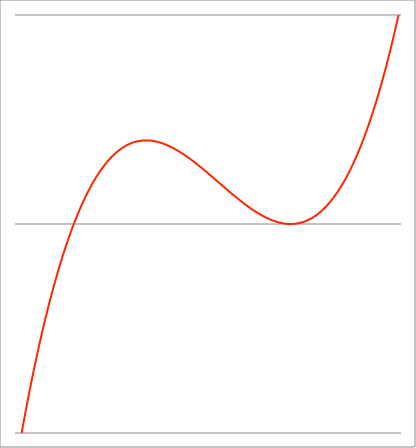
| Category | Series 1 |
|---|---|
| -3.8 | -1.155 |
| -3.79733 | -1.15 |
| -3.794659999999999 | -1.144 |
| -3.791989999999999 | -1.139 |
| -3.78932 | -1.133 |
| -3.786649999999999 | -1.128 |
| -3.783979999999999 | -1.123 |
| -3.781309999999999 | -1.117 |
| -3.778639999999998 | -1.112 |
| -3.775969999999998 | -1.106 |
| -3.773299999999998 | -1.101 |
| -3.770629999999998 | -1.096 |
| -3.767959999999998 | -1.09 |
| -3.765289999999998 | -1.085 |
| -3.762619999999997 | -1.08 |
| -3.759949999999997 | -1.074 |
| -3.757279999999997 | -1.069 |
| -3.754609999999997 | -1.064 |
| -3.751939999999997 | -1.059 |
| -3.749269999999996 | -1.053 |
| -3.746599999999996 | -1.048 |
| -3.743929999999996 | -1.043 |
| -3.741259999999996 | -1.038 |
| -3.738589999999996 | -1.032 |
| -3.735919999999996 | -1.027 |
| -3.733249999999995 | -1.022 |
| -3.730579999999995 | -1.017 |
| -3.727909999999995 | -1.012 |
| -3.725239999999995 | -1.006 |
| -3.722569999999995 | -1.001 |
| -3.719899999999995 | -0.996 |
| -3.717229999999994 | -0.991 |
| -3.714559999999994 | -0.986 |
| -3.711889999999994 | -0.981 |
| -3.709219999999994 | -0.976 |
| -3.706549999999994 | -0.971 |
| -3.703879999999994 | -0.966 |
| -3.701209999999993 | -0.961 |
| -3.698539999999993 | -0.956 |
| -3.695869999999993 | -0.951 |
| -3.693199999999993 | -0.946 |
| -3.690529999999993 | -0.941 |
| -3.687859999999992 | -0.936 |
| -3.685189999999992 | -0.931 |
| -3.682519999999992 | -0.926 |
| -3.679849999999992 | -0.921 |
| -3.677179999999992 | -0.916 |
| -3.674509999999992 | -0.911 |
| -3.671839999999991 | -0.906 |
| -3.669169999999991 | -0.901 |
| -3.666499999999991 | -0.896 |
| -3.663829999999991 | -0.891 |
| -3.661159999999991 | -0.886 |
| -3.658489999999991 | -0.881 |
| -3.65581999999999 | -0.877 |
| -3.65314999999999 | -0.872 |
| -3.65047999999999 | -0.867 |
| -3.64780999999999 | -0.862 |
| -3.64513999999999 | -0.857 |
| -3.64246999999999 | -0.852 |
| -3.639799999999989 | -0.848 |
| -3.637129999999989 | -0.843 |
| -3.634459999999989 | -0.838 |
| -3.631789999999989 | -0.833 |
| -3.629119999999989 | -0.829 |
| -3.626449999999989 | -0.824 |
| -3.623779999999988 | -0.819 |
| -3.621109999999988 | -0.814 |
| -3.618439999999988 | -0.81 |
| -3.615769999999988 | -0.805 |
| -3.613099999999988 | -0.8 |
| -3.610429999999988 | -0.796 |
| -3.607759999999987 | -0.791 |
| -3.605089999999987 | -0.786 |
| -3.602419999999987 | -0.782 |
| -3.599749999999987 | -0.777 |
| -3.597079999999987 | -0.773 |
| -3.594409999999987 | -0.768 |
| -3.591739999999986 | -0.763 |
| -3.589069999999986 | -0.759 |
| -3.586399999999986 | -0.754 |
| -3.583729999999986 | -0.75 |
| -3.581059999999986 | -0.745 |
| -3.578389999999986 | -0.741 |
| -3.575719999999985 | -0.736 |
| -3.573049999999985 | -0.732 |
| -3.570379999999985 | -0.727 |
| -3.567709999999985 | -0.723 |
| -3.565039999999985 | -0.718 |
| -3.562369999999984 | -0.714 |
| -3.559699999999984 | -0.709 |
| -3.557029999999984 | -0.705 |
| -3.554359999999984 | -0.7 |
| -3.551689999999984 | -0.696 |
| -3.549019999999984 | -0.692 |
| -3.546349999999983 | -0.687 |
| -3.543679999999983 | -0.683 |
| -3.541009999999983 | -0.678 |
| -3.538339999999983 | -0.674 |
| -3.535669999999983 | -0.67 |
| -3.532999999999983 | -0.665 |
| -3.530329999999982 | -0.661 |
| -3.527659999999982 | -0.657 |
| -3.524989999999982 | -0.652 |
| -3.522319999999982 | -0.648 |
| -3.519649999999982 | -0.644 |
| -3.516979999999982 | -0.639 |
| -3.514309999999981 | -0.635 |
| -3.511639999999981 | -0.631 |
| -3.508969999999981 | -0.627 |
| -3.506299999999981 | -0.622 |
| -3.503629999999981 | -0.618 |
| -3.500959999999981 | -0.614 |
| -3.49828999999998 | -0.61 |
| -3.49561999999998 | -0.606 |
| -3.49294999999998 | -0.601 |
| -3.49027999999998 | -0.597 |
| -3.48760999999998 | -0.593 |
| -3.484939999999979 | -0.589 |
| -3.482269999999979 | -0.585 |
| -3.479599999999979 | -0.581 |
| -3.476929999999979 | -0.577 |
| -3.474259999999979 | -0.572 |
| -3.471589999999979 | -0.568 |
| -3.468919999999978 | -0.564 |
| -3.466249999999978 | -0.56 |
| -3.463579999999978 | -0.556 |
| -3.460909999999978 | -0.552 |
| -3.458239999999978 | -0.548 |
| -3.455569999999978 | -0.544 |
| -3.452899999999977 | -0.54 |
| -3.450229999999977 | -0.536 |
| -3.447559999999977 | -0.532 |
| -3.444889999999977 | -0.528 |
| -3.442219999999977 | -0.524 |
| -3.439549999999977 | -0.52 |
| -3.436879999999976 | -0.516 |
| -3.434209999999976 | -0.512 |
| -3.431539999999976 | -0.508 |
| -3.428869999999976 | -0.504 |
| -3.426199999999976 | -0.5 |
| -3.423529999999976 | -0.496 |
| -3.420859999999975 | -0.493 |
| -3.418189999999975 | -0.489 |
| -3.415519999999975 | -0.485 |
| -3.412849999999975 | -0.481 |
| -3.410179999999975 | -0.477 |
| -3.407509999999974 | -0.473 |
| -3.404839999999974 | -0.469 |
| -3.402169999999974 | -0.466 |
| -3.399499999999974 | -0.462 |
| -3.396829999999974 | -0.458 |
| -3.394159999999974 | -0.454 |
| -3.391489999999973 | -0.45 |
| -3.388819999999973 | -0.447 |
| -3.386149999999973 | -0.443 |
| -3.383479999999973 | -0.439 |
| -3.380809999999973 | -0.435 |
| -3.378139999999973 | -0.432 |
| -3.375469999999972 | -0.428 |
| -3.372799999999972 | -0.424 |
| -3.370129999999972 | -0.42 |
| -3.367459999999972 | -0.417 |
| -3.364789999999972 | -0.413 |
| -3.362119999999972 | -0.409 |
| -3.359449999999971 | -0.406 |
| -3.356779999999971 | -0.402 |
| -3.354109999999971 | -0.398 |
| -3.351439999999971 | -0.395 |
| -3.348769999999971 | -0.391 |
| -3.34609999999997 | -0.388 |
| -3.34342999999997 | -0.384 |
| -3.34075999999997 | -0.38 |
| -3.33808999999997 | -0.377 |
| -3.33541999999997 | -0.373 |
| -3.33274999999997 | -0.37 |
| -3.330079999999969 | -0.366 |
| -3.327409999999969 | -0.362 |
| -3.324739999999969 | -0.359 |
| -3.322069999999969 | -0.355 |
| -3.319399999999969 | -0.352 |
| -3.316729999999969 | -0.348 |
| -3.314059999999968 | -0.345 |
| -3.311389999999968 | -0.341 |
| -3.308719999999968 | -0.338 |
| -3.306049999999968 | -0.335 |
| -3.303379999999968 | -0.331 |
| -3.300709999999968 | -0.328 |
| -3.298039999999967 | -0.324 |
| -3.295369999999967 | -0.321 |
| -3.292699999999967 | -0.317 |
| -3.290029999999967 | -0.314 |
| -3.287359999999967 | -0.311 |
| -3.284689999999967 | -0.307 |
| -3.282019999999966 | -0.304 |
| -3.279349999999966 | -0.3 |
| -3.276679999999966 | -0.297 |
| -3.274009999999966 | -0.294 |
| -3.271339999999966 | -0.29 |
| -3.268669999999966 | -0.287 |
| -3.265999999999965 | -0.284 |
| -3.263329999999965 | -0.28 |
| -3.260659999999965 | -0.277 |
| -3.257989999999965 | -0.274 |
| -3.255319999999965 | -0.271 |
| -3.252649999999964 | -0.267 |
| -3.249979999999964 | -0.264 |
| -3.247309999999964 | -0.261 |
| -3.244639999999964 | -0.258 |
| -3.241969999999964 | -0.254 |
| -3.239299999999964 | -0.251 |
| -3.236629999999963 | -0.248 |
| -3.233959999999963 | -0.245 |
| -3.231289999999963 | -0.241 |
| -3.228619999999963 | -0.238 |
| -3.225949999999963 | -0.235 |
| -3.223279999999963 | -0.232 |
| -3.220609999999962 | -0.229 |
| -3.217939999999962 | -0.226 |
| -3.215269999999962 | -0.223 |
| -3.212599999999962 | -0.219 |
| -3.209929999999962 | -0.216 |
| -3.207259999999962 | -0.213 |
| -3.204589999999961 | -0.21 |
| -3.201919999999961 | -0.207 |
| -3.199249999999961 | -0.204 |
| -3.196579999999961 | -0.201 |
| -3.193909999999961 | -0.198 |
| -3.191239999999961 | -0.195 |
| -3.18856999999996 | -0.192 |
| -3.18589999999996 | -0.189 |
| -3.18322999999996 | -0.186 |
| -3.18055999999996 | -0.183 |
| -3.17788999999996 | -0.18 |
| -3.17521999999996 | -0.177 |
| -3.172549999999959 | -0.174 |
| -3.169879999999959 | -0.171 |
| -3.167209999999959 | -0.168 |
| -3.164539999999959 | -0.165 |
| -3.161869999999959 | -0.162 |
| -3.159199999999958 | -0.159 |
| -3.156529999999958 | -0.156 |
| -3.153859999999958 | -0.153 |
| -3.151189999999958 | -0.15 |
| -3.148519999999958 | -0.147 |
| -3.145849999999958 | -0.144 |
| -3.143179999999957 | -0.141 |
| -3.140509999999957 | -0.139 |
| -3.137839999999957 | -0.136 |
| -3.135169999999957 | -0.133 |
| -3.132499999999957 | -0.13 |
| -3.129829999999957 | -0.127 |
| -3.127159999999956 | -0.124 |
| -3.124489999999956 | -0.122 |
| -3.121819999999956 | -0.119 |
| -3.119149999999956 | -0.116 |
| -3.116479999999956 | -0.113 |
| -3.113809999999956 | -0.11 |
| -3.111139999999955 | -0.108 |
| -3.108469999999955 | -0.105 |
| -3.105799999999955 | -0.102 |
| -3.103129999999955 | -0.099 |
| -3.100459999999955 | -0.097 |
| -3.097789999999954 | -0.094 |
| -3.095119999999954 | -0.091 |
| -3.092449999999954 | -0.088 |
| -3.089779999999954 | -0.086 |
| -3.087109999999954 | -0.083 |
| -3.084439999999954 | -0.08 |
| -3.081769999999953 | -0.078 |
| -3.079099999999953 | -0.075 |
| -3.076429999999953 | -0.072 |
| -3.073759999999953 | -0.07 |
| -3.071089999999953 | -0.067 |
| -3.068419999999953 | -0.064 |
| -3.065749999999952 | -0.062 |
| -3.063079999999952 | -0.059 |
| -3.060409999999952 | -0.057 |
| -3.057739999999952 | -0.054 |
| -3.055069999999952 | -0.051 |
| -3.052399999999952 | -0.049 |
| -3.049729999999951 | -0.046 |
| -3.047059999999951 | -0.044 |
| -3.044389999999951 | -0.041 |
| -3.041719999999951 | -0.039 |
| -3.039049999999951 | -0.036 |
| -3.036379999999951 | -0.034 |
| -3.03370999999995 | -0.031 |
| -3.03103999999995 | -0.029 |
| -3.02836999999995 | -0.026 |
| -3.02569999999995 | -0.024 |
| -3.02302999999995 | -0.021 |
| -3.02035999999995 | -0.019 |
| -3.017689999999949 | -0.016 |
| -3.015019999999949 | -0.014 |
| -3.012349999999949 | -0.011 |
| -3.009679999999949 | -0.009 |
| -3.007009999999949 | -0.006 |
| -3.004339999999948 | -0.004 |
| -3.001669999999948 | -0.002 |
| -2.998999999999948 | 0.001 |
| -2.996329999999948 | 0.003 |
| -2.993659999999948 | 0.006 |
| -2.990989999999948 | 0.008 |
| -2.988319999999947 | 0.01 |
| -2.985649999999947 | 0.013 |
| -2.982979999999947 | 0.015 |
| -2.980309999999947 | 0.017 |
| -2.977639999999947 | 0.02 |
| -2.974969999999947 | 0.022 |
| -2.972299999999946 | 0.024 |
| -2.969629999999946 | 0.027 |
| -2.966959999999946 | 0.029 |
| -2.964289999999946 | 0.031 |
| -2.961619999999946 | 0.034 |
| -2.958949999999946 | 0.036 |
| -2.956279999999945 | 0.038 |
| -2.953609999999945 | 0.04 |
| -2.950939999999945 | 0.043 |
| -2.948269999999945 | 0.045 |
| -2.945599999999945 | 0.047 |
| -2.942929999999945 | 0.049 |
| -2.940259999999944 | 0.052 |
| -2.937589999999944 | 0.054 |
| -2.934919999999944 | 0.056 |
| -2.932249999999944 | 0.058 |
| -2.929579999999944 | 0.06 |
| -2.926909999999943 | 0.063 |
| -2.924239999999943 | 0.065 |
| -2.921569999999943 | 0.067 |
| -2.918899999999943 | 0.069 |
| -2.916229999999943 | 0.071 |
| -2.913559999999943 | 0.073 |
| -2.910889999999942 | 0.076 |
| -2.908219999999942 | 0.078 |
| -2.905549999999942 | 0.08 |
| -2.902879999999942 | 0.082 |
| -2.900209999999942 | 0.084 |
| -2.897539999999942 | 0.086 |
| -2.894869999999941 | 0.088 |
| -2.892199999999941 | 0.09 |
| -2.889529999999941 | 0.092 |
| -2.886859999999941 | 0.094 |
| -2.884189999999941 | 0.096 |
| -2.881519999999941 | 0.098 |
| -2.87884999999994 | 0.1 |
| -2.87617999999994 | 0.102 |
| -2.87350999999994 | 0.104 |
| -2.87083999999994 | 0.106 |
| -2.86816999999994 | 0.108 |
| -2.865499999999939 | 0.11 |
| -2.862829999999939 | 0.112 |
| -2.860159999999939 | 0.114 |
| -2.857489999999939 | 0.116 |
| -2.854819999999939 | 0.118 |
| -2.852149999999939 | 0.12 |
| -2.849479999999938 | 0.122 |
| -2.846809999999938 | 0.124 |
| -2.844139999999938 | 0.126 |
| -2.841469999999938 | 0.128 |
| -2.838799999999938 | 0.13 |
| -2.836129999999938 | 0.132 |
| -2.833459999999937 | 0.134 |
| -2.830789999999937 | 0.136 |
| -2.828119999999937 | 0.137 |
| -2.825449999999937 | 0.139 |
| -2.822779999999937 | 0.141 |
| -2.820109999999937 | 0.143 |
| -2.817439999999936 | 0.145 |
| -2.814769999999936 | 0.147 |
| -2.812099999999936 | 0.149 |
| -2.809429999999936 | 0.15 |
| -2.806759999999936 | 0.152 |
| -2.804089999999936 | 0.154 |
| -2.801419999999935 | 0.156 |
| -2.798749999999935 | 0.158 |
| -2.796079999999935 | 0.159 |
| -2.793409999999935 | 0.161 |
| -2.790739999999935 | 0.163 |
| -2.788069999999934 | 0.165 |
| -2.785399999999934 | 0.166 |
| -2.782729999999934 | 0.168 |
| -2.780059999999934 | 0.17 |
| -2.777389999999934 | 0.172 |
| -2.774719999999934 | 0.173 |
| -2.772049999999933 | 0.175 |
| -2.769379999999933 | 0.177 |
| -2.766709999999933 | 0.179 |
| -2.764039999999933 | 0.18 |
| -2.761369999999933 | 0.182 |
| -2.758699999999933 | 0.184 |
| -2.756029999999932 | 0.185 |
| -2.753359999999932 | 0.187 |
| -2.750689999999932 | 0.189 |
| -2.748019999999932 | 0.19 |
| -2.745349999999932 | 0.192 |
| -2.742679999999932 | 0.194 |
| -2.740009999999931 | 0.195 |
| -2.737339999999931 | 0.197 |
| -2.734669999999931 | 0.198 |
| -2.731999999999931 | 0.2 |
| -2.729329999999931 | 0.202 |
| -2.726659999999931 | 0.203 |
| -2.72398999999993 | 0.205 |
| -2.72131999999993 | 0.206 |
| -2.71864999999993 | 0.208 |
| -2.71597999999993 | 0.21 |
| -2.71330999999993 | 0.211 |
| -2.710639999999929 | 0.213 |
| -2.707969999999929 | 0.214 |
| -2.705299999999929 | 0.216 |
| -2.702629999999929 | 0.217 |
| -2.699959999999929 | 0.219 |
| -2.697289999999929 | 0.22 |
| -2.694619999999928 | 0.222 |
| -2.691949999999928 | 0.223 |
| -2.689279999999928 | 0.225 |
| -2.686609999999928 | 0.226 |
| -2.683939999999928 | 0.228 |
| -2.681269999999928 | 0.229 |
| -2.678599999999927 | 0.231 |
| -2.675929999999927 | 0.232 |
| -2.673259999999927 | 0.233 |
| -2.670589999999927 | 0.235 |
| -2.667919999999927 | 0.236 |
| -2.665249999999927 | 0.238 |
| -2.662579999999926 | 0.239 |
| -2.659909999999926 | 0.241 |
| -2.657239999999926 | 0.242 |
| -2.654569999999926 | 0.243 |
| -2.651899999999926 | 0.245 |
| -2.649229999999925 | 0.246 |
| -2.646559999999925 | 0.248 |
| -2.643889999999925 | 0.249 |
| -2.641219999999925 | 0.25 |
| -2.638549999999925 | 0.252 |
| -2.635879999999925 | 0.253 |
| -2.633209999999924 | 0.254 |
| -2.630539999999924 | 0.256 |
| -2.627869999999924 | 0.257 |
| -2.625199999999924 | 0.258 |
| -2.622529999999924 | 0.26 |
| -2.619859999999924 | 0.261 |
| -2.617189999999923 | 0.262 |
| -2.614519999999923 | 0.264 |
| -2.611849999999923 | 0.265 |
| -2.609179999999923 | 0.266 |
| -2.606509999999923 | 0.267 |
| -2.603839999999923 | 0.269 |
| -2.601169999999922 | 0.27 |
| -2.598499999999922 | 0.271 |
| -2.595829999999922 | 0.272 |
| -2.593159999999922 | 0.274 |
| -2.590489999999922 | 0.275 |
| -2.587819999999922 | 0.276 |
| -2.585149999999921 | 0.277 |
| -2.582479999999921 | 0.278 |
| -2.579809999999921 | 0.28 |
| -2.577139999999921 | 0.281 |
| -2.574469999999921 | 0.282 |
| -2.571799999999921 | 0.283 |
| -2.56912999999992 | 0.284 |
| -2.56645999999992 | 0.286 |
| -2.56378999999992 | 0.287 |
| -2.56111999999992 | 0.288 |
| -2.55844999999992 | 0.289 |
| -2.55577999999992 | 0.29 |
| -2.553109999999919 | 0.291 |
| -2.550439999999919 | 0.292 |
| -2.54776999999992 | 0.294 |
| -2.545099999999919 | 0.295 |
| -2.542429999999919 | 0.296 |
| -2.539759999999919 | 0.297 |
| -2.537089999999918 | 0.298 |
| -2.534419999999918 | 0.299 |
| -2.531749999999918 | 0.3 |
| -2.529079999999918 | 0.301 |
| -2.526409999999918 | 0.302 |
| -2.523739999999917 | 0.303 |
| -2.521069999999917 | 0.304 |
| -2.518399999999917 | 0.305 |
| -2.515729999999917 | 0.306 |
| -2.513059999999917 | 0.308 |
| -2.510389999999917 | 0.309 |
| -2.507719999999916 | 0.31 |
| -2.505049999999916 | 0.311 |
| -2.502379999999916 | 0.312 |
| -2.499709999999916 | 0.313 |
| -2.497039999999916 | 0.314 |
| -2.494369999999916 | 0.315 |
| -2.491699999999915 | 0.316 |
| -2.489029999999915 | 0.317 |
| -2.486359999999915 | 0.318 |
| -2.483689999999915 | 0.318 |
| -2.481019999999915 | 0.319 |
| -2.478349999999915 | 0.32 |
| -2.475679999999914 | 0.321 |
| -2.473009999999914 | 0.322 |
| -2.470339999999914 | 0.323 |
| -2.467669999999914 | 0.324 |
| -2.464999999999914 | 0.325 |
| -2.462329999999913 | 0.326 |
| -2.459659999999913 | 0.327 |
| -2.456989999999913 | 0.328 |
| -2.454319999999913 | 0.329 |
| -2.451649999999913 | 0.33 |
| -2.448979999999913 | 0.33 |
| -2.446309999999912 | 0.331 |
| -2.443639999999912 | 0.332 |
| -2.440969999999912 | 0.333 |
| -2.438299999999912 | 0.334 |
| -2.435629999999912 | 0.335 |
| -2.432959999999912 | 0.336 |
| -2.430289999999911 | 0.336 |
| -2.427619999999911 | 0.337 |
| -2.424949999999911 | 0.338 |
| -2.422279999999911 | 0.339 |
| -2.419609999999911 | 0.34 |
| -2.416939999999911 | 0.341 |
| -2.41426999999991 | 0.341 |
| -2.41159999999991 | 0.342 |
| -2.40892999999991 | 0.343 |
| -2.40625999999991 | 0.344 |
| -2.40358999999991 | 0.345 |
| -2.40091999999991 | 0.345 |
| -2.398249999999909 | 0.346 |
| -2.395579999999909 | 0.347 |
| -2.392909999999909 | 0.348 |
| -2.390239999999909 | 0.348 |
| -2.387569999999909 | 0.349 |
| -2.384899999999908 | 0.35 |
| -2.382229999999908 | 0.351 |
| -2.379559999999908 | 0.351 |
| -2.376889999999908 | 0.352 |
| -2.374219999999908 | 0.353 |
| -2.371549999999908 | 0.353 |
| -2.368879999999907 | 0.354 |
| -2.366209999999907 | 0.355 |
| -2.363539999999907 | 0.356 |
| -2.360869999999907 | 0.356 |
| -2.358199999999907 | 0.357 |
| -2.355529999999907 | 0.358 |
| -2.352859999999906 | 0.358 |
| -2.350189999999906 | 0.359 |
| -2.347519999999906 | 0.36 |
| -2.344849999999906 | 0.36 |
| -2.342179999999906 | 0.361 |
| -2.339509999999906 | 0.362 |
| -2.336839999999905 | 0.362 |
| -2.334169999999905 | 0.363 |
| -2.331499999999905 | 0.363 |
| -2.328829999999905 | 0.364 |
| -2.326159999999905 | 0.365 |
| -2.323489999999905 | 0.365 |
| -2.320819999999904 | 0.366 |
| -2.318149999999904 | 0.366 |
| -2.315479999999904 | 0.367 |
| -2.312809999999904 | 0.368 |
| -2.310139999999904 | 0.368 |
| -2.307469999999903 | 0.369 |
| -2.304799999999903 | 0.369 |
| -2.302129999999903 | 0.37 |
| -2.299459999999903 | 0.37 |
| -2.296789999999903 | 0.371 |
| -2.294119999999903 | 0.372 |
| -2.291449999999902 | 0.372 |
| -2.288779999999902 | 0.373 |
| -2.286109999999902 | 0.373 |
| -2.283439999999902 | 0.374 |
| -2.280769999999902 | 0.374 |
| -2.278099999999902 | 0.375 |
| -2.275429999999901 | 0.375 |
| -2.272759999999901 | 0.376 |
| -2.270089999999901 | 0.376 |
| -2.267419999999901 | 0.377 |
| -2.264749999999901 | 0.377 |
| -2.262079999999901 | 0.378 |
| -2.2594099999999 | 0.378 |
| -2.2567399999999 | 0.379 |
| -2.2540699999999 | 0.379 |
| -2.2513999999999 | 0.379 |
| -2.2487299999999 | 0.38 |
| -2.2460599999999 | 0.38 |
| -2.243389999999899 | 0.381 |
| -2.240719999999899 | 0.381 |
| -2.238049999999899 | 0.382 |
| -2.235379999999899 | 0.382 |
| -2.232709999999899 | 0.382 |
| -2.230039999999899 | 0.383 |
| -2.227369999999898 | 0.383 |
| -2.224699999999898 | 0.384 |
| -2.222029999999898 | 0.384 |
| -2.219359999999898 | 0.385 |
| -2.216689999999898 | 0.385 |
| -2.214019999999898 | 0.385 |
| -2.211349999999897 | 0.386 |
| -2.208679999999897 | 0.386 |
| -2.206009999999897 | 0.386 |
| -2.203339999999897 | 0.387 |
| -2.200669999999897 | 0.387 |
| -2.197999999999896 | 0.387 |
| -2.195329999999896 | 0.388 |
| -2.192659999999896 | 0.388 |
| -2.189989999999896 | 0.388 |
| -2.187319999999896 | 0.389 |
| -2.184649999999896 | 0.389 |
| -2.181979999999895 | 0.389 |
| -2.179309999999895 | 0.39 |
| -2.176639999999895 | 0.39 |
| -2.173969999999895 | 0.39 |
| -2.171299999999895 | 0.391 |
| -2.168629999999895 | 0.391 |
| -2.165959999999894 | 0.391 |
| -2.163289999999894 | 0.392 |
| -2.160619999999894 | 0.392 |
| -2.157949999999894 | 0.392 |
| -2.155279999999894 | 0.392 |
| -2.152609999999894 | 0.393 |
| -2.149939999999893 | 0.393 |
| -2.147269999999893 | 0.393 |
| -2.144599999999893 | 0.393 |
| -2.141929999999893 | 0.394 |
| -2.139259999999893 | 0.394 |
| -2.136589999999893 | 0.394 |
| -2.133919999999892 | 0.394 |
| -2.131249999999892 | 0.395 |
| -2.128579999999892 | 0.395 |
| -2.125909999999892 | 0.395 |
| -2.123239999999892 | 0.395 |
| -2.120569999999891 | 0.395 |
| -2.117899999999891 | 0.396 |
| -2.115229999999891 | 0.396 |
| -2.112559999999891 | 0.396 |
| -2.109889999999891 | 0.396 |
| -2.107219999999891 | 0.396 |
| -2.10454999999989 | 0.397 |
| -2.10187999999989 | 0.397 |
| -2.09920999999989 | 0.397 |
| -2.09653999999989 | 0.397 |
| -2.09386999999989 | 0.397 |
| -2.09119999999989 | 0.397 |
| -2.088529999999889 | 0.398 |
| -2.085859999999889 | 0.398 |
| -2.083189999999889 | 0.398 |
| -2.080519999999889 | 0.398 |
| -2.077849999999889 | 0.398 |
| -2.075179999999889 | 0.398 |
| -2.072509999999888 | 0.398 |
| -2.069839999999888 | 0.399 |
| -2.067169999999888 | 0.399 |
| -2.064499999999888 | 0.399 |
| -2.061829999999888 | 0.399 |
| -2.059159999999888 | 0.399 |
| -2.056489999999887 | 0.399 |
| -2.053819999999887 | 0.399 |
| -2.051149999999887 | 0.399 |
| -2.048479999999887 | 0.399 |
| -2.045809999999887 | 0.399 |
| -2.043139999999886 | 0.399 |
| -2.040469999999886 | 0.4 |
| -2.037799999999886 | 0.4 |
| -2.035129999999886 | 0.4 |
| -2.032459999999886 | 0.4 |
| -2.029789999999886 | 0.4 |
| -2.027119999999885 | 0.4 |
| -2.024449999999885 | 0.4 |
| -2.021779999999885 | 0.4 |
| -2.019109999999885 | 0.4 |
| -2.016439999999885 | 0.4 |
| -2.013769999999885 | 0.4 |
| -2.011099999999884 | 0.4 |
| -2.008429999999884 | 0.4 |
| -2.005759999999884 | 0.4 |
| -2.003089999999884 | 0.4 |
| -2.000419999999884 | 0.4 |
| -1.997749999999884 | 0.4 |
| -1.995079999999884 | 0.4 |
| -1.992409999999884 | 0.4 |
| -1.989739999999884 | 0.4 |
| -1.987069999999884 | 0.4 |
| -1.984399999999884 | 0.4 |
| -1.981729999999884 | 0.4 |
| -1.979059999999884 | 0.4 |
| -1.976389999999884 | 0.4 |
| -1.973719999999884 | 0.4 |
| -1.971049999999884 | 0.4 |
| -1.968379999999884 | 0.4 |
| -1.965709999999884 | 0.4 |
| -1.963039999999884 | 0.4 |
| -1.960369999999884 | 0.4 |
| -1.957699999999884 | 0.399 |
| -1.955029999999885 | 0.399 |
| -1.952359999999885 | 0.399 |
| -1.949689999999885 | 0.399 |
| -1.947019999999885 | 0.399 |
| -1.944349999999885 | 0.399 |
| -1.941679999999885 | 0.399 |
| -1.939009999999885 | 0.399 |
| -1.936339999999885 | 0.399 |
| -1.933669999999885 | 0.399 |
| -1.930999999999885 | 0.399 |
| -1.928329999999885 | 0.398 |
| -1.925659999999885 | 0.398 |
| -1.922989999999885 | 0.398 |
| -1.920319999999885 | 0.398 |
| -1.917649999999885 | 0.398 |
| -1.914979999999885 | 0.398 |
| -1.912309999999885 | 0.398 |
| -1.909639999999885 | 0.398 |
| -1.906969999999885 | 0.397 |
| -1.904299999999886 | 0.397 |
| -1.901629999999886 | 0.397 |
| -1.898959999999886 | 0.397 |
| -1.896289999999886 | 0.397 |
| -1.893619999999886 | 0.397 |
| -1.890949999999886 | 0.397 |
| -1.888279999999886 | 0.396 |
| -1.885609999999886 | 0.396 |
| -1.882939999999886 | 0.396 |
| -1.880269999999886 | 0.396 |
| -1.877599999999886 | 0.396 |
| -1.874929999999886 | 0.396 |
| -1.872259999999886 | 0.395 |
| -1.869589999999886 | 0.395 |
| -1.866919999999886 | 0.395 |
| -1.864249999999886 | 0.395 |
| -1.861579999999886 | 0.395 |
| -1.858909999999886 | 0.394 |
| -1.856239999999886 | 0.394 |
| -1.853569999999886 | 0.394 |
| -1.850899999999886 | 0.394 |
| -1.848229999999887 | 0.393 |
| -1.845559999999887 | 0.393 |
| -1.842889999999887 | 0.393 |
| -1.840219999999887 | 0.393 |
| -1.837549999999887 | 0.393 |
| -1.834879999999887 | 0.392 |
| -1.832209999999887 | 0.392 |
| -1.829539999999887 | 0.392 |
| -1.826869999999887 | 0.392 |
| -1.824199999999887 | 0.391 |
| -1.821529999999887 | 0.391 |
| -1.818859999999887 | 0.391 |
| -1.816189999999887 | 0.39 |
| -1.813519999999887 | 0.39 |
| -1.810849999999887 | 0.39 |
| -1.808179999999887 | 0.39 |
| -1.805509999999887 | 0.389 |
| -1.802839999999887 | 0.389 |
| -1.800169999999887 | 0.389 |
| -1.797499999999887 | 0.389 |
| -1.794829999999887 | 0.388 |
| -1.792159999999888 | 0.388 |
| -1.789489999999888 | 0.388 |
| -1.786819999999888 | 0.387 |
| -1.784149999999888 | 0.387 |
| -1.781479999999888 | 0.387 |
| -1.778809999999888 | 0.386 |
| -1.776139999999888 | 0.386 |
| -1.773469999999888 | 0.386 |
| -1.770799999999888 | 0.385 |
| -1.768129999999888 | 0.385 |
| -1.765459999999888 | 0.385 |
| -1.762789999999888 | 0.384 |
| -1.760119999999888 | 0.384 |
| -1.757449999999888 | 0.384 |
| -1.754779999999888 | 0.383 |
| -1.752109999999888 | 0.383 |
| -1.749439999999888 | 0.383 |
| -1.746769999999888 | 0.382 |
| -1.744099999999888 | 0.382 |
| -1.741429999999888 | 0.382 |
| -1.738759999999889 | 0.381 |
| -1.736089999999889 | 0.381 |
| -1.733419999999889 | 0.381 |
| -1.730749999999889 | 0.38 |
| -1.728079999999889 | 0.38 |
| -1.725409999999889 | 0.379 |
| -1.722739999999889 | 0.379 |
| -1.720069999999889 | 0.379 |
| -1.717399999999889 | 0.378 |
| -1.714729999999889 | 0.378 |
| -1.71205999999989 | 0.378 |
| -1.70938999999989 | 0.377 |
| -1.70671999999989 | 0.377 |
| -1.70404999999989 | 0.376 |
| -1.701379999999889 | 0.376 |
| -1.698709999999889 | 0.376 |
| -1.696039999999889 | 0.375 |
| -1.693369999999889 | 0.375 |
| -1.690699999999889 | 0.374 |
| -1.688029999999889 | 0.374 |
| -1.68535999999989 | 0.373 |
| -1.68268999999989 | 0.373 |
| -1.68001999999989 | 0.373 |
| -1.67734999999989 | 0.372 |
| -1.67467999999989 | 0.372 |
| -1.67200999999989 | 0.371 |
| -1.66933999999989 | 0.371 |
| -1.66666999999989 | 0.37 |
| -1.66399999999989 | 0.37 |
| -1.66132999999989 | 0.369 |
| -1.65865999999989 | 0.369 |
| -1.65598999999989 | 0.369 |
| -1.65331999999989 | 0.368 |
| -1.65064999999989 | 0.368 |
| -1.64797999999989 | 0.367 |
| -1.64530999999989 | 0.367 |
| -1.64263999999989 | 0.366 |
| -1.63996999999989 | 0.366 |
| -1.63729999999989 | 0.365 |
| -1.63462999999989 | 0.365 |
| -1.631959999999891 | 0.364 |
| -1.629289999999891 | 0.364 |
| -1.626619999999891 | 0.363 |
| -1.623949999999891 | 0.363 |
| -1.621279999999891 | 0.362 |
| -1.618609999999891 | 0.362 |
| -1.615939999999891 | 0.361 |
| -1.613269999999891 | 0.361 |
| -1.610599999999891 | 0.36 |
| -1.607929999999891 | 0.36 |
| -1.605259999999891 | 0.359 |
| -1.602589999999891 | 0.359 |
| -1.599919999999891 | 0.358 |
| -1.597249999999891 | 0.358 |
| -1.594579999999891 | 0.357 |
| -1.591909999999891 | 0.357 |
| -1.589239999999891 | 0.356 |
| -1.586569999999891 | 0.356 |
| -1.583899999999891 | 0.355 |
| -1.581229999999892 | 0.355 |
| -1.578559999999892 | 0.354 |
| -1.575889999999892 | 0.354 |
| -1.573219999999892 | 0.353 |
| -1.570549999999892 | 0.353 |
| -1.567879999999892 | 0.352 |
| -1.565209999999892 | 0.352 |
| -1.562539999999892 | 0.351 |
| -1.559869999999892 | 0.35 |
| -1.557199999999892 | 0.35 |
| -1.554529999999892 | 0.349 |
| -1.551859999999892 | 0.349 |
| -1.549189999999892 | 0.348 |
| -1.546519999999892 | 0.348 |
| -1.543849999999892 | 0.347 |
| -1.541179999999892 | 0.347 |
| -1.538509999999892 | 0.346 |
| -1.535839999999892 | 0.345 |
| -1.533169999999892 | 0.345 |
| -1.530499999999892 | 0.344 |
| -1.527829999999893 | 0.344 |
| -1.525159999999893 | 0.343 |
| -1.522489999999893 | 0.342 |
| -1.519819999999893 | 0.342 |
| -1.517149999999893 | 0.341 |
| -1.514479999999893 | 0.341 |
| -1.511809999999893 | 0.34 |
| -1.509139999999893 | 0.34 |
| -1.506469999999893 | 0.339 |
| -1.503799999999893 | 0.338 |
| -1.501129999999893 | 0.338 |
| -1.498459999999893 | 0.337 |
| -1.495789999999893 | 0.337 |
| -1.493119999999893 | 0.336 |
| -1.490449999999893 | 0.335 |
| -1.487779999999893 | 0.335 |
| -1.485109999999893 | 0.334 |
| -1.482439999999893 | 0.334 |
| -1.479769999999893 | 0.333 |
| -1.477099999999893 | 0.332 |
| -1.474429999999894 | 0.332 |
| -1.471759999999894 | 0.331 |
| -1.469089999999894 | 0.33 |
| -1.466419999999894 | 0.33 |
| -1.463749999999894 | 0.329 |
| -1.461079999999894 | 0.329 |
| -1.458409999999894 | 0.328 |
| -1.455739999999894 | 0.327 |
| -1.453069999999894 | 0.327 |
| -1.450399999999894 | 0.326 |
| -1.447729999999894 | 0.325 |
| -1.445059999999894 | 0.325 |
| -1.442389999999894 | 0.324 |
| -1.439719999999894 | 0.323 |
| -1.437049999999894 | 0.323 |
| -1.434379999999894 | 0.322 |
| -1.431709999999894 | 0.321 |
| -1.429039999999894 | 0.321 |
| -1.426369999999894 | 0.32 |
| -1.423699999999894 | 0.32 |
| -1.421029999999895 | 0.319 |
| -1.418359999999895 | 0.318 |
| -1.415689999999895 | 0.318 |
| -1.413019999999895 | 0.317 |
| -1.410349999999895 | 0.316 |
| -1.407679999999895 | 0.316 |
| -1.405009999999895 | 0.315 |
| -1.402339999999895 | 0.314 |
| -1.399669999999895 | 0.314 |
| -1.396999999999895 | 0.313 |
| -1.394329999999895 | 0.312 |
| -1.391659999999895 | 0.311 |
| -1.388989999999895 | 0.311 |
| -1.386319999999895 | 0.31 |
| -1.383649999999895 | 0.309 |
| -1.380979999999895 | 0.309 |
| -1.378309999999895 | 0.308 |
| -1.375639999999895 | 0.307 |
| -1.372969999999895 | 0.307 |
| -1.370299999999895 | 0.306 |
| -1.367629999999895 | 0.305 |
| -1.364959999999896 | 0.305 |
| -1.362289999999896 | 0.304 |
| -1.359619999999896 | 0.303 |
| -1.356949999999896 | 0.303 |
| -1.354279999999896 | 0.302 |
| -1.351609999999896 | 0.301 |
| -1.348939999999896 | 0.3 |
| -1.346269999999896 | 0.3 |
| -1.343599999999896 | 0.299 |
| -1.340929999999896 | 0.298 |
| -1.338259999999896 | 0.298 |
| -1.335589999999896 | 0.297 |
| -1.332919999999896 | 0.296 |
| -1.330249999999896 | 0.295 |
| -1.327579999999896 | 0.295 |
| -1.324909999999896 | 0.294 |
| -1.322239999999896 | 0.293 |
| -1.319569999999896 | 0.293 |
| -1.316899999999896 | 0.292 |
| -1.314229999999896 | 0.291 |
| -1.311559999999897 | 0.29 |
| -1.308889999999897 | 0.29 |
| -1.306219999999897 | 0.289 |
| -1.303549999999897 | 0.288 |
| -1.300879999999897 | 0.288 |
| -1.298209999999897 | 0.287 |
| -1.295539999999897 | 0.286 |
| -1.292869999999897 | 0.285 |
| -1.290199999999897 | 0.285 |
| -1.287529999999897 | 0.284 |
| -1.284859999999897 | 0.283 |
| -1.282189999999897 | 0.282 |
| -1.279519999999897 | 0.282 |
| -1.276849999999897 | 0.281 |
| -1.274179999999897 | 0.28 |
| -1.271509999999897 | 0.279 |
| -1.268839999999897 | 0.279 |
| -1.266169999999897 | 0.278 |
| -1.263499999999897 | 0.277 |
| -1.260829999999898 | 0.276 |
| -1.258159999999898 | 0.276 |
| -1.255489999999898 | 0.275 |
| -1.252819999999898 | 0.274 |
| -1.250149999999898 | 0.273 |
| -1.247479999999898 | 0.273 |
| -1.244809999999898 | 0.272 |
| -1.242139999999898 | 0.271 |
| -1.239469999999898 | 0.27 |
| -1.236799999999898 | 0.27 |
| -1.234129999999898 | 0.269 |
| -1.231459999999898 | 0.268 |
| -1.228789999999898 | 0.267 |
| -1.226119999999898 | 0.267 |
| -1.223449999999898 | 0.266 |
| -1.220779999999898 | 0.265 |
| -1.218109999999898 | 0.264 |
| -1.215439999999898 | 0.264 |
| -1.212769999999898 | 0.263 |
| -1.210099999999898 | 0.262 |
| -1.207429999999899 | 0.261 |
| -1.204759999999899 | 0.261 |
| -1.202089999999899 | 0.26 |
| -1.199419999999899 | 0.259 |
| -1.196749999999899 | 0.258 |
| -1.194079999999899 | 0.257 |
| -1.191409999999899 | 0.257 |
| -1.188739999999899 | 0.256 |
| -1.186069999999899 | 0.255 |
| -1.183399999999899 | 0.254 |
| -1.1807299999999 | 0.254 |
| -1.1780599999999 | 0.253 |
| -1.1753899999999 | 0.252 |
| -1.1727199999999 | 0.251 |
| -1.1700499999999 | 0.251 |
| -1.167379999999899 | 0.25 |
| -1.164709999999899 | 0.249 |
| -1.162039999999899 | 0.248 |
| -1.159369999999899 | 0.247 |
| -1.156699999999899 | 0.247 |
| -1.1540299999999 | 0.246 |
| -1.1513599999999 | 0.245 |
| -1.1486899999999 | 0.244 |
| -1.1460199999999 | 0.243 |
| -1.1433499999999 | 0.243 |
| -1.1406799999999 | 0.242 |
| -1.1380099999999 | 0.241 |
| -1.1353399999999 | 0.24 |
| -1.1326699999999 | 0.24 |
| -1.1299999999999 | 0.239 |
| -1.1273299999999 | 0.238 |
| -1.1246599999999 | 0.237 |
| -1.1219899999999 | 0.236 |
| -1.1193199999999 | 0.236 |
| -1.1166499999999 | 0.235 |
| -1.1139799999999 | 0.234 |
| -1.1113099999999 | 0.233 |
| -1.1086399999999 | 0.232 |
| -1.1059699999999 | 0.232 |
| -1.1032999999999 | 0.231 |
| -1.100629999999901 | 0.23 |
| -1.097959999999901 | 0.229 |
| -1.095289999999901 | 0.229 |
| -1.092619999999901 | 0.228 |
| -1.089949999999901 | 0.227 |
| -1.087279999999901 | 0.226 |
| -1.084609999999901 | 0.225 |
| -1.081939999999901 | 0.225 |
| -1.079269999999901 | 0.224 |
| -1.076599999999901 | 0.223 |
| -1.073929999999901 | 0.222 |
| -1.071259999999901 | 0.221 |
| -1.068589999999901 | 0.221 |
| -1.065919999999901 | 0.22 |
| -1.063249999999901 | 0.219 |
| -1.060579999999901 | 0.218 |
| -1.057909999999901 | 0.217 |
| -1.055239999999901 | 0.217 |
| -1.052569999999901 | 0.216 |
| -1.049899999999901 | 0.215 |
| -1.047229999999902 | 0.214 |
| -1.044559999999902 | 0.213 |
| -1.041889999999902 | 0.213 |
| -1.039219999999902 | 0.212 |
| -1.036549999999902 | 0.211 |
| -1.033879999999902 | 0.21 |
| -1.031209999999902 | 0.209 |
| -1.028539999999902 | 0.209 |
| -1.025869999999902 | 0.208 |
| -1.023199999999902 | 0.207 |
| -1.020529999999902 | 0.206 |
| -1.017859999999902 | 0.205 |
| -1.015189999999902 | 0.205 |
| -1.012519999999902 | 0.204 |
| -1.009849999999902 | 0.203 |
| -1.007179999999902 | 0.202 |
| -1.004509999999902 | 0.201 |
| -1.001839999999902 | 0.201 |
| -0.999169999999902 | 0.2 |
| -0.996499999999902 | 0.199 |
| -0.993829999999902 | 0.198 |
| -0.991159999999903 | 0.197 |
| -0.988489999999903 | 0.197 |
| -0.985819999999903 | 0.196 |
| -0.983149999999903 | 0.195 |
| -0.980479999999903 | 0.194 |
| -0.977809999999903 | 0.193 |
| -0.975139999999903 | 0.193 |
| -0.972469999999903 | 0.192 |
| -0.969799999999903 | 0.191 |
| -0.967129999999903 | 0.19 |
| -0.964459999999903 | 0.189 |
| -0.961789999999903 | 0.189 |
| -0.959119999999903 | 0.188 |
| -0.956449999999903 | 0.187 |
| -0.953779999999903 | 0.186 |
| -0.951109999999903 | 0.185 |
| -0.948439999999903 | 0.185 |
| -0.945769999999903 | 0.184 |
| -0.943099999999903 | 0.183 |
| -0.940429999999903 | 0.182 |
| -0.937759999999904 | 0.181 |
| -0.935089999999904 | 0.181 |
| -0.932419999999904 | 0.18 |
| -0.929749999999904 | 0.179 |
| -0.927079999999904 | 0.178 |
| -0.924409999999904 | 0.177 |
| -0.921739999999904 | 0.177 |
| -0.919069999999904 | 0.176 |
| -0.916399999999904 | 0.175 |
| -0.913729999999904 | 0.174 |
| -0.911059999999904 | 0.173 |
| -0.908389999999904 | 0.173 |
| -0.905719999999904 | 0.172 |
| -0.903049999999904 | 0.171 |
| -0.900379999999904 | 0.17 |
| -0.897709999999904 | 0.169 |
| -0.895039999999904 | 0.169 |
| -0.892369999999904 | 0.168 |
| -0.889699999999904 | 0.167 |
| -0.887029999999904 | 0.166 |
| -0.884359999999904 | 0.165 |
| -0.881689999999905 | 0.165 |
| -0.879019999999905 | 0.164 |
| -0.876349999999905 | 0.163 |
| -0.873679999999905 | 0.162 |
| -0.871009999999905 | 0.162 |
| -0.868339999999905 | 0.161 |
| -0.865669999999905 | 0.16 |
| -0.862999999999905 | 0.159 |
| -0.860329999999905 | 0.158 |
| -0.857659999999905 | 0.158 |
| -0.854989999999905 | 0.157 |
| -0.852319999999905 | 0.156 |
| -0.849649999999905 | 0.155 |
| -0.846979999999905 | 0.154 |
| -0.844309999999905 | 0.154 |
| -0.841639999999905 | 0.153 |
| -0.838969999999905 | 0.152 |
| -0.836299999999905 | 0.151 |
| -0.833629999999905 | 0.151 |
| -0.830959999999906 | 0.15 |
| -0.828289999999906 | 0.149 |
| -0.825619999999906 | 0.148 |
| -0.822949999999906 | 0.147 |
| -0.820279999999906 | 0.147 |
| -0.817609999999906 | 0.146 |
| -0.814939999999906 | 0.145 |
| -0.812269999999906 | 0.144 |
| -0.809599999999906 | 0.144 |
| -0.806929999999906 | 0.143 |
| -0.804259999999906 | 0.142 |
| -0.801589999999906 | 0.141 |
| -0.798919999999906 | 0.14 |
| -0.796249999999906 | 0.14 |
| -0.793579999999906 | 0.139 |
| -0.790909999999906 | 0.138 |
| -0.788239999999906 | 0.137 |
| -0.785569999999906 | 0.137 |
| -0.782899999999906 | 0.136 |
| -0.780229999999906 | 0.135 |
| -0.777559999999906 | 0.134 |
| -0.774889999999907 | 0.134 |
| -0.772219999999907 | 0.133 |
| -0.769549999999907 | 0.132 |
| -0.766879999999907 | 0.131 |
| -0.764209999999907 | 0.131 |
| -0.761539999999907 | 0.13 |
| -0.758869999999907 | 0.129 |
| -0.756199999999907 | 0.128 |
| -0.753529999999907 | 0.128 |
| -0.750859999999907 | 0.127 |
| -0.748189999999907 | 0.126 |
| -0.745519999999907 | 0.125 |
| -0.742849999999907 | 0.125 |
| -0.740179999999907 | 0.124 |
| -0.737509999999907 | 0.123 |
| -0.734839999999907 | 0.122 |
| -0.732169999999907 | 0.122 |
| -0.729499999999907 | 0.121 |
| -0.726829999999907 | 0.12 |
| -0.724159999999907 | 0.119 |
| -0.721489999999908 | 0.119 |
| -0.718819999999908 | 0.118 |
| -0.716149999999908 | 0.117 |
| -0.713479999999908 | 0.116 |
| -0.710809999999908 | 0.116 |
| -0.708139999999908 | 0.115 |
| -0.705469999999908 | 0.114 |
| -0.702799999999908 | 0.113 |
| -0.700129999999908 | 0.113 |
| -0.697459999999908 | 0.112 |
| -0.694789999999908 | 0.111 |
| -0.692119999999908 | 0.111 |
| -0.689449999999908 | 0.11 |
| -0.686779999999908 | 0.109 |
| -0.684109999999908 | 0.108 |
| -0.681439999999908 | 0.108 |
| -0.678769999999908 | 0.107 |
| -0.676099999999908 | 0.106 |
| -0.673429999999908 | 0.106 |
| -0.670759999999908 | 0.105 |
| -0.668089999999908 | 0.104 |
| -0.665419999999909 | 0.103 |
| -0.662749999999909 | 0.103 |
| -0.660079999999909 | 0.102 |
| -0.657409999999909 | 0.101 |
| -0.654739999999909 | 0.101 |
| -0.652069999999909 | 0.1 |
| -0.649399999999909 | 0.099 |
| -0.646729999999909 | 0.098 |
| -0.644059999999909 | 0.098 |
| -0.641389999999909 | 0.097 |
| -0.638719999999909 | 0.096 |
| -0.636049999999909 | 0.096 |
| -0.633379999999909 | 0.095 |
| -0.630709999999909 | 0.094 |
| -0.628039999999909 | 0.094 |
| -0.625369999999909 | 0.093 |
| -0.622699999999909 | 0.092 |
| -0.620029999999909 | 0.091 |
| -0.617359999999909 | 0.091 |
| -0.614689999999909 | 0.09 |
| -0.61201999999991 | 0.089 |
| -0.60934999999991 | 0.089 |
| -0.60667999999991 | 0.088 |
| -0.60400999999991 | 0.087 |
| -0.60133999999991 | 0.087 |
| -0.59866999999991 | 0.086 |
| -0.59599999999991 | 0.085 |
| -0.59332999999991 | 0.085 |
| -0.59065999999991 | 0.084 |
| -0.58798999999991 | 0.083 |
| -0.58531999999991 | 0.083 |
| -0.58264999999991 | 0.082 |
| -0.57997999999991 | 0.081 |
| -0.57730999999991 | 0.081 |
| -0.57463999999991 | 0.08 |
| -0.57196999999991 | 0.079 |
| -0.56929999999991 | 0.079 |
| -0.56662999999991 | 0.078 |
| -0.563959999999911 | 0.077 |
| -0.561289999999911 | 0.077 |
| -0.558619999999911 | 0.076 |
| -0.555949999999911 | 0.076 |
| -0.553279999999911 | 0.075 |
| -0.550609999999911 | 0.074 |
| -0.547939999999911 | 0.074 |
| -0.545269999999911 | 0.073 |
| -0.542599999999911 | 0.072 |
| -0.539929999999911 | 0.072 |
| -0.537259999999911 | 0.071 |
| -0.534589999999911 | 0.07 |
| -0.531919999999911 | 0.07 |
| -0.529249999999911 | 0.069 |
| -0.526579999999911 | 0.069 |
| -0.523909999999911 | 0.068 |
| -0.521239999999911 | 0.067 |
| -0.518569999999911 | 0.067 |
| -0.515899999999911 | 0.066 |
| -0.513229999999911 | 0.066 |
| -0.510559999999912 | 0.065 |
| -0.507889999999912 | 0.064 |
| -0.505219999999912 | 0.064 |
| -0.502549999999912 | 0.063 |
| -0.499879999999912 | 0.062 |
| -0.497209999999912 | 0.062 |
| -0.494539999999912 | 0.061 |
| -0.491869999999912 | 0.061 |
| -0.489199999999912 | 0.06 |
| -0.486529999999912 | 0.059 |
| -0.483859999999912 | 0.059 |
| -0.481189999999912 | 0.058 |
| -0.478519999999912 | 0.058 |
| -0.475849999999912 | 0.057 |
| -0.473179999999912 | 0.057 |
| -0.470509999999912 | 0.056 |
| -0.467839999999912 | 0.055 |
| -0.465169999999912 | 0.055 |
| -0.462499999999912 | 0.054 |
| -0.459829999999912 | 0.054 |
| -0.457159999999912 | 0.053 |
| -0.454489999999912 | 0.053 |
| -0.451819999999912 | 0.052 |
| -0.449149999999912 | 0.051 |
| -0.446479999999912 | 0.051 |
| -0.443809999999912 | 0.05 |
| -0.441139999999912 | 0.05 |
| -0.438469999999912 | 0.049 |
| -0.435799999999912 | 0.049 |
| -0.433129999999912 | 0.048 |
| -0.430459999999911 | 0.048 |
| -0.427789999999911 | 0.047 |
| -0.425119999999911 | 0.047 |
| -0.422449999999911 | 0.046 |
| -0.419779999999911 | 0.045 |
| -0.417109999999911 | 0.045 |
| -0.414439999999911 | 0.044 |
| -0.411769999999911 | 0.044 |
| -0.409099999999911 | 0.043 |
| -0.406429999999911 | 0.043 |
| -0.403759999999911 | 0.042 |
| -0.401089999999911 | 0.042 |
| -0.398419999999911 | 0.041 |
| -0.395749999999911 | 0.041 |
| -0.393079999999911 | 0.04 |
| -0.390409999999911 | 0.04 |
| -0.387739999999911 | 0.039 |
| -0.385069999999911 | 0.039 |
| -0.382399999999911 | 0.038 |
| -0.379729999999911 | 0.038 |
| -0.377059999999911 | 0.037 |
| -0.374389999999911 | 0.037 |
| -0.371719999999911 | 0.036 |
| -0.369049999999911 | 0.036 |
| -0.366379999999911 | 0.035 |
| -0.363709999999911 | 0.035 |
| -0.361039999999911 | 0.034 |
| -0.358369999999911 | 0.034 |
| -0.355699999999911 | 0.033 |
| -0.353029999999911 | 0.033 |
| -0.350359999999911 | 0.033 |
| -0.347689999999911 | 0.032 |
| -0.345019999999911 | 0.032 |
| -0.342349999999911 | 0.031 |
| -0.339679999999911 | 0.031 |
| -0.337009999999911 | 0.03 |
| -0.334339999999911 | 0.03 |
| -0.331669999999911 | 0.029 |
| -0.328999999999911 | 0.029 |
| -0.326329999999911 | 0.028 |
| -0.323659999999911 | 0.028 |
| -0.320989999999911 | 0.028 |
| -0.318319999999911 | 0.027 |
| -0.315649999999911 | 0.027 |
| -0.312979999999911 | 0.026 |
| -0.310309999999911 | 0.026 |
| -0.307639999999911 | 0.025 |
| -0.304969999999911 | 0.025 |
| -0.302299999999911 | 0.025 |
| -0.299629999999911 | 0.024 |
| -0.296959999999911 | 0.024 |
| -0.294289999999911 | 0.023 |
| -0.291619999999911 | 0.023 |
| -0.288949999999911 | 0.023 |
| -0.286279999999911 | 0.022 |
| -0.283609999999911 | 0.022 |
| -0.280939999999911 | 0.021 |
| -0.278269999999911 | 0.021 |
| -0.275599999999911 | 0.021 |
| -0.272929999999911 | 0.02 |
| -0.270259999999911 | 0.02 |
| -0.267589999999911 | 0.02 |
| -0.264919999999911 | 0.019 |
| -0.262249999999911 | 0.019 |
| -0.259579999999911 | 0.018 |
| -0.256909999999911 | 0.018 |
| -0.254239999999911 | 0.018 |
| -0.251569999999911 | 0.017 |
| -0.248899999999911 | 0.017 |
| -0.246229999999911 | 0.017 |
| -0.243559999999911 | 0.016 |
| -0.240889999999911 | 0.016 |
| -0.238219999999911 | 0.016 |
| -0.235549999999911 | 0.015 |
| -0.232879999999911 | 0.015 |
| -0.230209999999911 | 0.015 |
| -0.227539999999911 | 0.014 |
| -0.224869999999911 | 0.014 |
| -0.222199999999911 | 0.014 |
| -0.219529999999911 | 0.013 |
| -0.216859999999911 | 0.013 |
| -0.214189999999911 | 0.013 |
| -0.211519999999911 | 0.012 |
| -0.208849999999911 | 0.012 |
| -0.206179999999911 | 0.012 |
| -0.203509999999911 | 0.012 |
| -0.200839999999911 | 0.011 |
| -0.198169999999911 | 0.011 |
| -0.195499999999911 | 0.011 |
| -0.192829999999911 | 0.01 |
| -0.190159999999911 | 0.01 |
| -0.187489999999911 | 0.01 |
| -0.184819999999911 | 0.01 |
| -0.182149999999911 | 0.009 |
| -0.179479999999911 | 0.009 |
| -0.176809999999911 | 0.009 |
| -0.174139999999911 | 0.009 |
| -0.171469999999911 | 0.008 |
| -0.168799999999911 | 0.008 |
| -0.166129999999911 | 0.008 |
| -0.163459999999911 | 0.008 |
| -0.160789999999911 | 0.007 |
| -0.158119999999911 | 0.007 |
| -0.155449999999911 | 0.007 |
| -0.152779999999911 | 0.007 |
| -0.150109999999911 | 0.006 |
| -0.147439999999911 | 0.006 |
| -0.144769999999911 | 0.006 |
| -0.142099999999911 | 0.006 |
| -0.139429999999911 | 0.006 |
| -0.136759999999911 | 0.005 |
| -0.134089999999911 | 0.005 |
| -0.131419999999911 | 0.005 |
| -0.128749999999911 | 0.005 |
| -0.126079999999911 | 0.005 |
| -0.123409999999911 | 0.004 |
| -0.120739999999911 | 0.004 |
| -0.118069999999911 | 0.004 |
| -0.115399999999911 | 0.004 |
| -0.112729999999911 | 0.004 |
| -0.110059999999911 | 0.004 |
| -0.107389999999911 | 0.003 |
| -0.104719999999911 | 0.003 |
| -0.102049999999911 | 0.003 |
| -0.0993799999999108 | 0.003 |
| -0.0967099999999108 | 0.003 |
| -0.0940399999999108 | 0.003 |
| -0.0913699999999108 | 0.002 |
| -0.0886999999999108 | 0.002 |
| -0.0860299999999108 | 0.002 |
| -0.0833599999999108 | 0.002 |
| -0.0806899999999108 | 0.002 |
| -0.0780199999999108 | 0.002 |
| -0.0753499999999108 | 0.002 |
| -0.0726799999999108 | 0.002 |
| -0.0700099999999107 | 0.001 |
| -0.0673399999999107 | 0.001 |
| -0.0646699999999107 | 0.001 |
| -0.0619999999999107 | 0.001 |
| -0.0593299999999107 | 0.001 |
| -0.0566599999999107 | 0.001 |
| -0.0539899999999107 | 0.001 |
| -0.0513199999999107 | 0.001 |
| -0.0486499999999107 | 0.001 |
| -0.0459799999999107 | 0.001 |
| -0.0433099999999107 | 0.001 |
| -0.0406399999999107 | 0 |
| -0.0379699999999107 | 0 |
| -0.0352999999999108 | 0 |
| -0.0326299999999108 | 0 |
| -0.0299599999999108 | 0 |
| -0.0272899999999108 | 0 |
| -0.0246199999999108 | 0 |
| -0.0219499999999108 | 0 |
| -0.0192799999999108 | 0 |
| -0.0166099999999108 | 0 |
| -0.0139399999999108 | 0 |
| -0.0112699999999108 | 0 |
| -0.00859999999991076 | 0 |
| -0.00592999999991076 | 0 |
| -0.00325999999991076 | 0 |
| -0.000589999999910763 | 0 |
| 0.00208000000008924 | 0 |
| 0.00475000000008924 | 0 |
| 0.00742000000008924 | 0 |
| 0.0100900000000892 | 0 |
| 0.0127600000000892 | 0 |
| 0.0154300000000892 | 0 |
| 0.0181000000000892 | 0 |
| 0.0207700000000892 | 0 |
| 0.0234400000000892 | 0 |
| 0.0261100000000892 | 0 |
| 0.0287800000000892 | 0 |
| 0.0314500000000892 | 0 |
| 0.0341200000000892 | 0 |
| 0.0367900000000892 | 0 |
| 0.0394600000000892 | 0 |
| 0.0421300000000892 | 0.001 |
| 0.0448000000000892 | 0.001 |
| 0.0474700000000892 | 0.001 |
| 0.0501400000000892 | 0.001 |
| 0.0528100000000892 | 0.001 |
| 0.0554800000000892 | 0.001 |
| 0.0581500000000892 | 0.001 |
| 0.0608200000000892 | 0.001 |
| 0.0634900000000892 | 0.001 |
| 0.0661600000000892 | 0.001 |
| 0.0688300000000892 | 0.001 |
| 0.0715000000000892 | 0.002 |
| 0.0741700000000892 | 0.002 |
| 0.0768400000000892 | 0.002 |
| 0.0795100000000892 | 0.002 |
| 0.0821800000000892 | 0.002 |
| 0.0848500000000893 | 0.002 |
| 0.0875200000000893 | 0.002 |
| 0.0901900000000893 | 0.003 |
| 0.0928600000000893 | 0.003 |
| 0.0955300000000893 | 0.003 |
| 0.0982000000000893 | 0.003 |
| 0.100870000000089 | 0.003 |
| 0.103540000000089 | 0.003 |
| 0.106210000000089 | 0.004 |
| 0.108880000000089 | 0.004 |
| 0.111550000000089 | 0.004 |
| 0.114220000000089 | 0.004 |
| 0.116890000000089 | 0.004 |
| 0.119560000000089 | 0.004 |
| 0.122230000000089 | 0.005 |
| 0.124900000000089 | 0.005 |
| 0.127570000000089 | 0.005 |
| 0.130240000000089 | 0.005 |
| 0.132910000000089 | 0.006 |
| 0.135580000000089 | 0.006 |
| 0.138250000000089 | 0.006 |
| 0.140920000000089 | 0.006 |
| 0.143590000000089 | 0.006 |
| 0.146260000000089 | 0.007 |
| 0.148930000000089 | 0.007 |
| 0.151600000000089 | 0.007 |
| 0.154270000000089 | 0.008 |
| 0.156940000000089 | 0.008 |
| 0.159610000000089 | 0.008 |
| 0.162280000000089 | 0.008 |
| 0.164950000000089 | 0.009 |
| 0.167620000000089 | 0.009 |
| 0.170290000000089 | 0.009 |
| 0.172960000000089 | 0.009 |
| 0.175630000000089 | 0.01 |
| 0.178300000000089 | 0.01 |
| 0.180970000000089 | 0.01 |
| 0.183640000000089 | 0.011 |
| 0.186310000000089 | 0.011 |
| 0.188980000000089 | 0.011 |
| 0.191650000000089 | 0.012 |
| 0.194320000000089 | 0.012 |
| 0.196990000000089 | 0.012 |
| 0.199660000000089 | 0.013 |
| 0.20233000000009 | 0.013 |
| 0.20500000000009 | 0.013 |
| 0.20767000000009 | 0.014 |
| 0.21034000000009 | 0.014 |
| 0.21301000000009 | 0.015 |
| 0.21568000000009 | 0.015 |
| 0.21835000000009 | 0.015 |
| 0.22102000000009 | 0.016 |
| 0.22369000000009 | 0.016 |
| 0.22636000000009 | 0.017 |
| 0.22903000000009 | 0.017 |
| 0.23170000000009 | 0.017 |
| 0.23437000000009 | 0.018 |
| 0.23704000000009 | 0.018 |
| 0.23971000000009 | 0.019 |
| 0.24238000000009 | 0.019 |
| 0.24505000000009 | 0.019 |
| 0.24772000000009 | 0.02 |
| 0.25039000000009 | 0.02 |
| 0.25306000000009 | 0.021 |
| 0.25573000000009 | 0.021 |
| 0.25840000000009 | 0.022 |
| 0.26107000000009 | 0.022 |
| 0.26374000000009 | 0.023 |
| 0.26641000000009 | 0.023 |
| 0.26908000000009 | 0.024 |
| 0.27175000000009 | 0.024 |
| 0.27442000000009 | 0.025 |
| 0.27709000000009 | 0.025 |
| 0.27976000000009 | 0.026 |
| 0.28243000000009 | 0.026 |
| 0.28510000000009 | 0.027 |
| 0.28777000000009 | 0.027 |
| 0.29044000000009 | 0.028 |
| 0.29311000000009 | 0.028 |
| 0.29578000000009 | 0.029 |
| 0.29845000000009 | 0.029 |
| 0.30112000000009 | 0.03 |
| 0.30379000000009 | 0.03 |
| 0.30646000000009 | 0.031 |
| 0.30913000000009 | 0.032 |
| 0.31180000000009 | 0.032 |
| 0.31447000000009 | 0.033 |
| 0.31714000000009 | 0.033 |
| 0.31981000000009 | 0.034 |
| 0.32248000000009 | 0.035 |
| 0.32515000000009 | 0.035 |
| 0.32782000000009 | 0.036 |
| 0.33049000000009 | 0.036 |
| 0.33316000000009 | 0.037 |
| 0.33583000000009 | 0.038 |
| 0.33850000000009 | 0.038 |
| 0.34117000000009 | 0.039 |
| 0.34384000000009 | 0.04 |
| 0.34651000000009 | 0.04 |
| 0.34918000000009 | 0.041 |
| 0.35185000000009 | 0.041 |
| 0.35452000000009 | 0.042 |
| 0.35719000000009 | 0.043 |
| 0.35986000000009 | 0.044 |
| 0.36253000000009 | 0.044 |
| 0.36520000000009 | 0.045 |
| 0.36787000000009 | 0.046 |
| 0.37054000000009 | 0.046 |
| 0.37321000000009 | 0.047 |
| 0.37588000000009 | 0.048 |
| 0.37855000000009 | 0.048 |
| 0.38122000000009 | 0.049 |
| 0.38389000000009 | 0.05 |
| 0.38656000000009 | 0.051 |
| 0.38923000000009 | 0.051 |
| 0.39190000000009 | 0.052 |
| 0.39457000000009 | 0.053 |
| 0.39724000000009 | 0.054 |
| 0.39991000000009 | 0.054 |
| 0.40258000000009 | 0.055 |
| 0.40525000000009 | 0.056 |
| 0.40792000000009 | 0.057 |
| 0.41059000000009 | 0.057 |
| 0.41326000000009 | 0.058 |
| 0.41593000000009 | 0.059 |
| 0.41860000000009 | 0.06 |
| 0.42127000000009 | 0.061 |
| 0.42394000000009 | 0.062 |
| 0.42661000000009 | 0.062 |
| 0.42928000000009 | 0.063 |
| 0.43195000000009 | 0.064 |
| 0.43462000000009 | 0.065 |
| 0.43729000000009 | 0.066 |
| 0.43996000000009 | 0.067 |
| 0.44263000000009 | 0.067 |
| 0.44530000000009 | 0.068 |
| 0.44797000000009 | 0.069 |
| 0.45064000000009 | 0.07 |
| 0.45331000000009 | 0.071 |
| 0.45598000000009 | 0.072 |
| 0.45865000000009 | 0.073 |
| 0.46132000000009 | 0.074 |
| 0.46399000000009 | 0.075 |
| 0.46666000000009 | 0.075 |
| 0.46933000000009 | 0.076 |
| 0.47200000000009 | 0.077 |
| 0.47467000000009 | 0.078 |
| 0.47734000000009 | 0.079 |
| 0.48001000000009 | 0.08 |
| 0.48268000000009 | 0.081 |
| 0.48535000000009 | 0.082 |
| 0.48802000000009 | 0.083 |
| 0.49069000000009 | 0.084 |
| 0.49336000000009 | 0.085 |
| 0.49603000000009 | 0.086 |
| 0.49870000000009 | 0.087 |
| 0.50137000000009 | 0.088 |
| 0.50404000000009 | 0.089 |
| 0.50671000000009 | 0.09 |
| 0.50938000000009 | 0.091 |
| 0.51205000000009 | 0.092 |
| 0.51472000000009 | 0.093 |
| 0.51739000000009 | 0.094 |
| 0.52006000000009 | 0.095 |
| 0.52273000000009 | 0.096 |
| 0.52540000000009 | 0.097 |
| 0.52807000000009 | 0.098 |
| 0.53074000000009 | 0.099 |
| 0.53341000000009 | 0.101 |
| 0.536080000000089 | 0.102 |
| 0.538750000000089 | 0.103 |
| 0.541420000000089 | 0.104 |
| 0.544090000000089 | 0.105 |
| 0.546760000000089 | 0.106 |
| 0.549430000000089 | 0.107 |
| 0.552100000000089 | 0.108 |
| 0.554770000000089 | 0.109 |
| 0.557440000000089 | 0.111 |
| 0.560110000000089 | 0.112 |
| 0.562780000000089 | 0.113 |
| 0.565450000000089 | 0.114 |
| 0.568120000000089 | 0.115 |
| 0.570790000000089 | 0.116 |
| 0.573460000000089 | 0.118 |
| 0.576130000000089 | 0.119 |
| 0.578800000000089 | 0.12 |
| 0.581470000000089 | 0.121 |
| 0.584140000000089 | 0.122 |
| 0.586810000000089 | 0.124 |
| 0.589480000000088 | 0.125 |
| 0.592150000000088 | 0.126 |
| 0.594820000000088 | 0.127 |
| 0.597490000000088 | 0.128 |
| 0.600160000000088 | 0.13 |
| 0.602830000000088 | 0.131 |
| 0.605500000000088 | 0.132 |
| 0.608170000000088 | 0.133 |
| 0.610840000000088 | 0.135 |
| 0.613510000000088 | 0.136 |
| 0.616180000000088 | 0.137 |
| 0.618850000000088 | 0.139 |
| 0.621520000000088 | 0.14 |
| 0.624190000000088 | 0.141 |
| 0.626860000000088 | 0.143 |
| 0.629530000000088 | 0.144 |
| 0.632200000000088 | 0.145 |
| 0.634870000000088 | 0.147 |
| 0.637540000000087 | 0.148 |
| 0.640210000000087 | 0.149 |
| 0.642880000000087 | 0.151 |
| 0.645550000000087 | 0.152 |
| 0.648220000000087 | 0.153 |
| 0.650890000000087 | 0.155 |
| 0.653560000000087 | 0.156 |
| 0.656230000000087 | 0.157 |
| 0.658900000000087 | 0.159 |
| 0.661570000000087 | 0.16 |
| 0.664240000000087 | 0.162 |
| 0.666910000000087 | 0.163 |
| 0.669580000000087 | 0.165 |
| 0.672250000000087 | 0.166 |
| 0.674920000000087 | 0.167 |
| 0.677590000000087 | 0.169 |
| 0.680260000000087 | 0.17 |
| 0.682930000000087 | 0.172 |
| 0.685600000000087 | 0.173 |
| 0.688270000000087 | 0.175 |
| 0.690940000000086 | 0.176 |
| 0.693610000000086 | 0.178 |
| 0.696280000000086 | 0.179 |
| 0.698950000000086 | 0.181 |
| 0.701620000000086 | 0.182 |
| 0.704290000000086 | 0.184 |
| 0.706960000000086 | 0.185 |
| 0.709630000000086 | 0.187 |
| 0.712300000000086 | 0.188 |
| 0.714970000000086 | 0.19 |
| 0.717640000000086 | 0.191 |
| 0.720310000000086 | 0.193 |
| 0.722980000000086 | 0.195 |
| 0.725650000000086 | 0.196 |
| 0.728320000000086 | 0.198 |
| 0.730990000000086 | 0.199 |
| 0.733660000000086 | 0.201 |
| 0.736330000000086 | 0.203 |
| 0.739000000000086 | 0.204 |
| 0.741670000000086 | 0.206 |
| 0.744340000000086 | 0.207 |
| 0.747010000000085 | 0.209 |
| 0.749680000000085 | 0.211 |
| 0.752350000000085 | 0.212 |
| 0.755020000000085 | 0.214 |
| 0.757690000000085 | 0.216 |
| 0.760360000000085 | 0.217 |
| 0.763030000000085 | 0.219 |
| 0.765700000000085 | 0.221 |
| 0.768370000000085 | 0.222 |
| 0.771040000000085 | 0.224 |
| 0.773710000000085 | 0.226 |
| 0.776380000000085 | 0.228 |
| 0.779050000000085 | 0.229 |
| 0.781720000000085 | 0.231 |
| 0.784390000000085 | 0.233 |
| 0.787060000000085 | 0.235 |
| 0.789730000000085 | 0.236 |
| 0.792400000000085 | 0.238 |
| 0.795070000000085 | 0.24 |
| 0.797740000000085 | 0.242 |
| 0.800410000000085 | 0.243 |
| 0.803080000000084 | 0.245 |
| 0.805750000000084 | 0.247 |
| 0.808420000000084 | 0.249 |
| 0.811090000000084 | 0.251 |
| 0.813760000000084 | 0.253 |
| 0.816430000000084 | 0.254 |
| 0.819100000000084 | 0.256 |
| 0.821770000000084 | 0.258 |
| 0.824440000000084 | 0.26 |
| 0.827110000000084 | 0.262 |
| 0.829780000000084 | 0.264 |
| 0.832450000000084 | 0.266 |
| 0.835120000000084 | 0.267 |
| 0.837790000000084 | 0.269 |
| 0.840460000000084 | 0.271 |
| 0.843130000000084 | 0.273 |
| 0.845800000000084 | 0.275 |
| 0.848470000000084 | 0.277 |
| 0.851140000000084 | 0.279 |
| 0.853810000000084 | 0.281 |
| 0.856480000000083 | 0.283 |
| 0.859150000000083 | 0.285 |
| 0.861820000000083 | 0.287 |
| 0.864490000000083 | 0.289 |
| 0.867160000000083 | 0.291 |
| 0.869830000000083 | 0.293 |
| 0.872500000000083 | 0.295 |
| 0.875170000000083 | 0.297 |
| 0.877840000000083 | 0.299 |
| 0.880510000000083 | 0.301 |
| 0.883180000000083 | 0.303 |
| 0.885850000000083 | 0.305 |
| 0.888520000000083 | 0.307 |
| 0.891190000000083 | 0.309 |
| 0.893860000000083 | 0.311 |
| 0.896530000000083 | 0.313 |
| 0.899200000000083 | 0.315 |
| 0.901870000000083 | 0.317 |
| 0.904540000000083 | 0.319 |
| 0.907210000000083 | 0.322 |
| 0.909880000000082 | 0.324 |
| 0.912550000000082 | 0.326 |
| 0.915220000000082 | 0.328 |
| 0.917890000000082 | 0.33 |
| 0.920560000000082 | 0.332 |
| 0.923230000000082 | 0.334 |
| 0.925900000000082 | 0.337 |
| 0.928570000000082 | 0.339 |
| 0.931240000000082 | 0.341 |
| 0.933910000000082 | 0.343 |
| 0.936580000000082 | 0.345 |
| 0.939250000000082 | 0.348 |
| 0.941920000000082 | 0.35 |
| 0.944590000000082 | 0.352 |
| 0.947260000000082 | 0.354 |
| 0.949930000000082 | 0.356 |
| 0.952600000000082 | 0.359 |
| 0.955270000000082 | 0.361 |
| 0.957940000000082 | 0.363 |
| 0.960610000000082 | 0.365 |
| 0.963280000000081 | 0.368 |
| 0.965950000000081 | 0.37 |
| 0.968620000000081 | 0.372 |
| 0.971290000000081 | 0.375 |
| 0.973960000000081 | 0.377 |
| 0.976630000000081 | 0.379 |
| 0.979300000000081 | 0.382 |
| 0.981970000000081 | 0.384 |
| 0.984640000000081 | 0.386 |
| 0.987310000000081 | 0.389 |
| 0.989980000000081 | 0.391 |
| 0.992650000000081 | 0.393 |
| 0.995320000000081 | 0.396 |
| 0.997990000000081 | 0.398 |
| 1.000660000000081 | 0.401 |
| 1.003330000000081 | 0.403 |
| 1.006000000000081 | 0.405 |
| 1.008670000000081 | 0.408 |
| 1.011340000000081 | 0.41 |
| 1.014010000000081 | 0.413 |
| 1.016680000000081 | 0.415 |
| 1.019350000000081 | 0.418 |
| 1.022020000000081 | 0.42 |
| 1.02469000000008 | 0.423 |
| 1.02736000000008 | 0.425 |
| 1.03003000000008 | 0.428 |
| 1.03270000000008 | 0.43 |
| 1.03537000000008 | 0.433 |
| 1.03804000000008 | 0.435 |
| 1.04071000000008 | 0.438 |
| 1.04338000000008 | 0.44 |
| 1.04605000000008 | 0.443 |
| 1.04872000000008 | 0.445 |
| 1.05139000000008 | 0.448 |
| 1.05406000000008 | 0.45 |
| 1.05673000000008 | 0.453 |
| 1.05940000000008 | 0.456 |
| 1.06207000000008 | 0.458 |
| 1.06474000000008 | 0.461 |
| 1.06741000000008 | 0.463 |
| 1.07008000000008 | 0.466 |
| 1.07275000000008 | 0.469 |
| 1.07542000000008 | 0.471 |
| 1.078090000000079 | 0.474 |
| 1.080760000000079 | 0.477 |
| 1.083430000000079 | 0.479 |
| 1.086100000000079 | 0.482 |
| 1.088770000000079 | 0.485 |
| 1.091440000000079 | 0.487 |
| 1.09411000000008 | 0.49 |
| 1.09678000000008 | 0.493 |
| 1.09945000000008 | 0.496 |
| 1.10212000000008 | 0.498 |
| 1.104790000000079 | 0.501 |
| 1.107460000000079 | 0.504 |
| 1.110130000000079 | 0.507 |
| 1.112800000000079 | 0.509 |
| 1.115470000000079 | 0.512 |
| 1.118140000000079 | 0.515 |
| 1.120810000000079 | 0.518 |
| 1.123480000000079 | 0.52 |
| 1.126150000000079 | 0.523 |
| 1.128820000000079 | 0.526 |
| 1.131490000000078 | 0.529 |
| 1.134160000000078 | 0.532 |
| 1.136830000000078 | 0.535 |
| 1.139500000000078 | 0.537 |
| 1.142170000000078 | 0.54 |
| 1.144840000000078 | 0.543 |
| 1.147510000000078 | 0.546 |
| 1.150180000000078 | 0.549 |
| 1.152850000000078 | 0.552 |
| 1.155520000000078 | 0.555 |
| 1.158190000000078 | 0.558 |
| 1.160860000000078 | 0.561 |
| 1.163530000000078 | 0.564 |
| 1.166200000000078 | 0.567 |
| 1.168870000000078 | 0.57 |
| 1.171540000000078 | 0.573 |
| 1.174210000000078 | 0.576 |
| 1.176880000000078 | 0.579 |
| 1.179550000000078 | 0.582 |
| 1.182220000000078 | 0.585 |
| 1.184890000000077 | 0.588 |
| 1.187560000000077 | 0.591 |
| 1.190230000000077 | 0.594 |
| 1.192900000000077 | 0.597 |
| 1.195570000000077 | 0.6 |
| 1.198240000000077 | 0.603 |
| 1.200910000000077 | 0.606 |
| 1.203580000000077 | 0.609 |
| 1.206250000000077 | 0.612 |
| 1.208920000000077 | 0.615 |
| 1.211590000000077 | 0.618 |
| 1.214260000000077 | 0.621 |
| 1.216930000000077 | 0.624 |
| 1.219600000000077 | 0.628 |
| 1.222270000000077 | 0.631 |
| 1.224940000000077 | 0.634 |
| 1.227610000000077 | 0.637 |
| 1.230280000000077 | 0.64 |
| 1.232950000000077 | 0.643 |
| 1.235620000000077 | 0.647 |
| 1.238290000000076 | 0.65 |
| 1.240960000000076 | 0.653 |
| 1.243630000000076 | 0.656 |
| 1.246300000000076 | 0.66 |
| 1.248970000000076 | 0.663 |
| 1.251640000000076 | 0.666 |
| 1.254310000000076 | 0.669 |
| 1.256980000000076 | 0.673 |
| 1.259650000000076 | 0.676 |
| 1.262320000000076 | 0.679 |
| 1.264990000000076 | 0.682 |
| 1.267660000000076 | 0.686 |
| 1.270330000000076 | 0.689 |
| 1.273000000000076 | 0.692 |
| 1.275670000000076 | 0.696 |
| 1.278340000000076 | 0.699 |
| 1.281010000000076 | 0.703 |
| 1.283680000000076 | 0.706 |
| 1.286350000000076 | 0.709 |
| 1.289020000000076 | 0.713 |
| 1.291690000000075 | 0.716 |
| 1.294360000000075 | 0.719 |
| 1.297030000000075 | 0.723 |
| 1.299700000000075 | 0.726 |
| 1.302370000000075 | 0.73 |
| 1.305040000000075 | 0.733 |
| 1.307710000000075 | 0.737 |
| 1.310380000000075 | 0.74 |
| 1.313050000000075 | 0.744 |
| 1.315720000000075 | 0.747 |
| 1.318390000000075 | 0.751 |
| 1.321060000000075 | 0.754 |
| 1.323730000000075 | 0.758 |
| 1.326400000000075 | 0.761 |
| 1.329070000000075 | 0.765 |
| 1.331740000000075 | 0.768 |
| 1.334410000000075 | 0.772 |
| 1.337080000000075 | 0.775 |
| 1.339750000000075 | 0.779 |
| 1.342420000000075 | 0.783 |
| 1.345090000000074 | 0.786 |
| 1.347760000000074 | 0.79 |
| 1.350430000000074 | 0.793 |
| 1.353100000000074 | 0.797 |
| 1.355770000000074 | 0.801 |
| 1.358440000000074 | 0.804 |
| 1.361110000000074 | 0.808 |
| 1.363780000000074 | 0.812 |
| 1.366450000000074 | 0.815 |
| 1.369120000000074 | 0.819 |
| 1.371790000000074 | 0.823 |
| 1.374460000000074 | 0.826 |
| 1.377130000000074 | 0.83 |
| 1.379800000000074 | 0.834 |
| 1.382470000000074 | 0.838 |
| 1.385140000000074 | 0.841 |
| 1.387810000000074 | 0.845 |
| 1.390480000000074 | 0.849 |
| 1.393150000000074 | 0.853 |
| 1.395820000000073 | 0.856 |
| 1.398490000000073 | 0.86 |
| 1.401160000000073 | 0.864 |
| 1.403830000000073 | 0.868 |
| 1.406500000000073 | 0.872 |
| 1.409170000000073 | 0.876 |
| 1.411840000000073 | 0.879 |
| 1.414510000000073 | 0.883 |
| 1.417180000000073 | 0.887 |
| 1.419850000000073 | 0.891 |
| 1.422520000000073 | 0.895 |
| 1.425190000000073 | 0.899 |
| 1.427860000000073 | 0.903 |
| 1.430530000000073 | 0.907 |
| 1.433200000000073 | 0.911 |
| 1.435870000000073 | 0.915 |
| 1.438540000000073 | 0.919 |
| 1.441210000000073 | 0.922 |
| 1.443880000000073 | 0.926 |
| 1.446550000000073 | 0.93 |
| 1.449220000000073 | 0.934 |
| 1.451890000000072 | 0.938 |
| 1.454560000000072 | 0.942 |
| 1.457230000000072 | 0.947 |
| 1.459900000000072 | 0.951 |
| 1.462570000000072 | 0.955 |
| 1.465240000000072 | 0.959 |
| 1.467910000000072 | 0.963 |
| 1.470580000000072 | 0.967 |
| 1.473250000000072 | 0.971 |
| 1.475920000000072 | 0.975 |
| 1.478590000000072 | 0.979 |
| 1.481260000000072 | 0.983 |
| 1.483930000000072 | 0.987 |
| 1.486600000000072 | 0.992 |
| 1.489270000000072 | 0.996 |
| 1.491940000000072 | 1 |
| 1.494610000000072 | 1.004 |
| 1.497280000000072 | 1.008 |
| 1.499950000000072 | 1.012 |
| 1.502620000000072 | 1.017 |
| 1.505290000000072 | 1.021 |
| 1.507960000000071 | 1.025 |
| 1.510630000000071 | 1.029 |
| 1.513300000000071 | 1.034 |
| 1.515970000000071 | 1.038 |
| 1.518640000000071 | 1.042 |
| 1.521310000000071 | 1.046 |
| 1.523980000000071 | 1.051 |
| 1.526650000000071 | 1.055 |
| 1.529320000000071 | 1.059 |
| 1.531990000000071 | 1.064 |
| 1.534660000000071 | 1.068 |
| 1.537330000000071 | 1.072 |
| 1.540000000000071 | 1.077 |